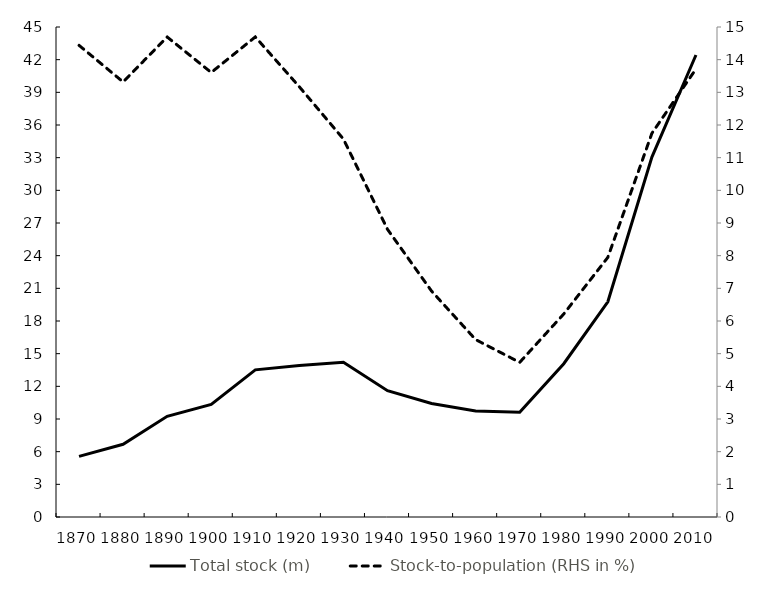
| Category | Total stock (m) |
|---|---|
| 1870 | 5.567 |
| 1880 | 6.68 |
| 1890 | 9.25 |
| 1900 | 10.341 |
| 1910 | 13.516 |
| 1920 | 13.921 |
| 1930 | 14.204 |
| 1940 | 11.595 |
| 1950 | 10.421 |
| 1960 | 9.738 |
| 1970 | 9.619 |
| 1980 | 14.08 |
| 1990 | 19.767 |
| 2000 | 33.055 |
| 2010 | 42.428 |